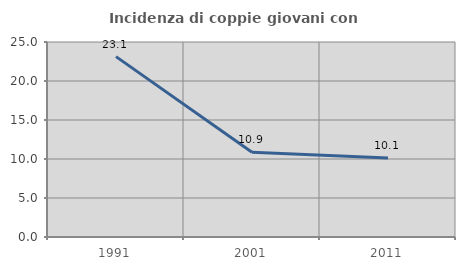
| Category | Incidenza di coppie giovani con figli |
|---|---|
| 1991.0 | 23.123 |
| 2001.0 | 10.854 |
| 2011.0 | 10.133 |